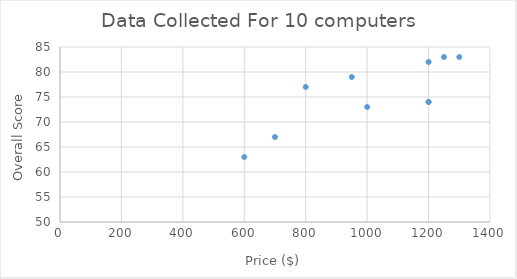
| Category | Overall Score |
|---|---|
| 1250.0 | 83 |
| 1300.0 | 83 |
| 1200.0 | 82 |
| 950.0 | 79 |
| 800.0 | 77 |
| 1200.0 | 74 |
| 1200.0 | 74 |
| 1000.0 | 73 |
| 700.0 | 67 |
| 600.0 | 63 |